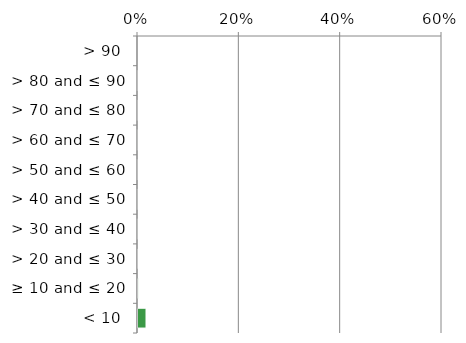
| Category | Near native & fragments |
|---|---|
| < 10 | 0.018 |
| ≥ 10 and ≤ 20 | 0.002 |
| > 20 and ≤ 30 | 0.001 |
| > 30 and ≤ 40 | 0 |
| > 40 and ≤ 50 | 0 |
| > 50 and ≤ 60 | 0 |
| > 60 and ≤ 70 | 0 |
| > 70 and ≤ 80 | 0 |
| > 80 and ≤ 90 | 0 |
| > 90 | 0 |